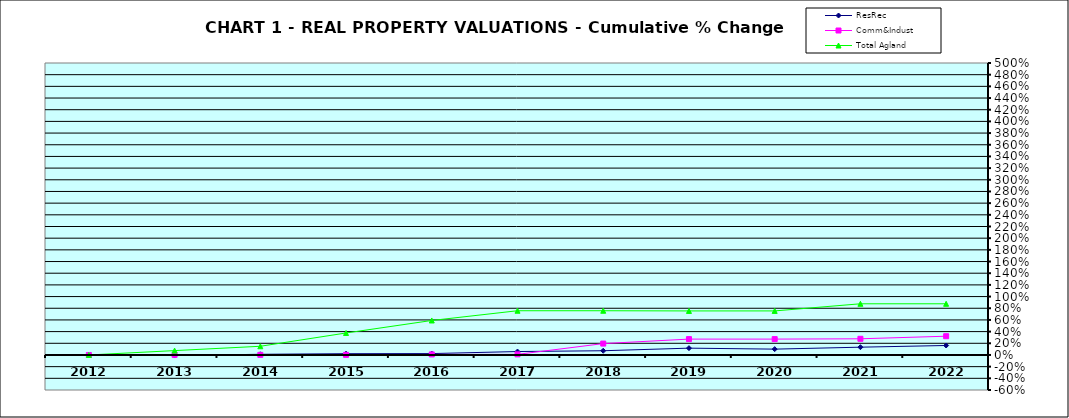
| Category | ResRec | Comm&Indust | Total Agland |
|---|---|---|---|
| 2012.0 | 0 | 0 | 0 |
| 2013.0 | -0.01 | 0.002 | 0.075 |
| 2014.0 | 0.012 | 0.002 | 0.149 |
| 2015.0 | 0.022 | 0.002 | 0.376 |
| 2016.0 | 0.024 | 0.009 | 0.591 |
| 2017.0 | 0.059 | 0.01 | 0.757 |
| 2018.0 | 0.072 | 0.195 | 0.757 |
| 2019.0 | 0.117 | 0.272 | 0.754 |
| 2020.0 | 0.1 | 0.272 | 0.754 |
| 2021.0 | 0.133 | 0.277 | 0.876 |
| 2022.0 | 0.162 | 0.321 | 0.877 |